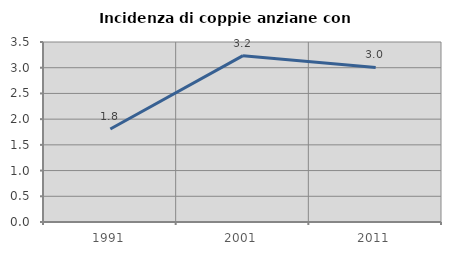
| Category | Incidenza di coppie anziane con figli |
|---|---|
| 1991.0 | 1.808 |
| 2001.0 | 3.235 |
| 2011.0 | 3.005 |